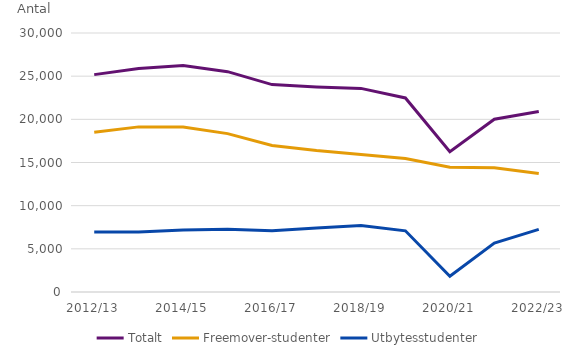
| Category | Totalt | Freemover-studenter | Utbytesstudenter |
|---|---|---|---|
| 2012/13 | 25179 | 18493 | 6948 |
| 2013/14 | 25875 | 19126 | 6946 |
| 2014/15 | 26235 | 19123 | 7178 |
| 2015/16 | 25523 | 18347 | 7255 |
| 2016/17 | 24024 | 16972 | 7108 |
| 2017/18 | 23755 | 16395 | 7417 |
| 2018/19 | 23584 | 15933 | 7714 |
| 2019/20 | 22479 | 15461 | 7087 |
| 2020/21 | 16250 | 14449 | 1823 |
| 2021/22 | 20017 | 14401 | 5666 |
| 2022/23 | 20910 | 13719 | 7257 |